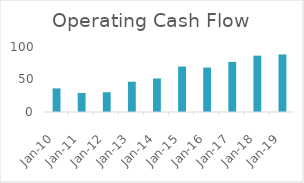
| Category | Operating Cash Flow |
|---|---|
| 2010-03-31 | 36.31 |
| 2011-03-31 | 29.28 |
| 2012-03-31 | 30.41 |
| 2013-03-31 | 46.63 |
| 2014-03-31 | 51.53 |
| 2015-03-31 | 69.97 |
| 2016-03-31 | 68.4 |
| 2017-03-31 | 77.13 |
| 2018-03-31 | 86.7 |
| 2019-03-31 | 88.51 |